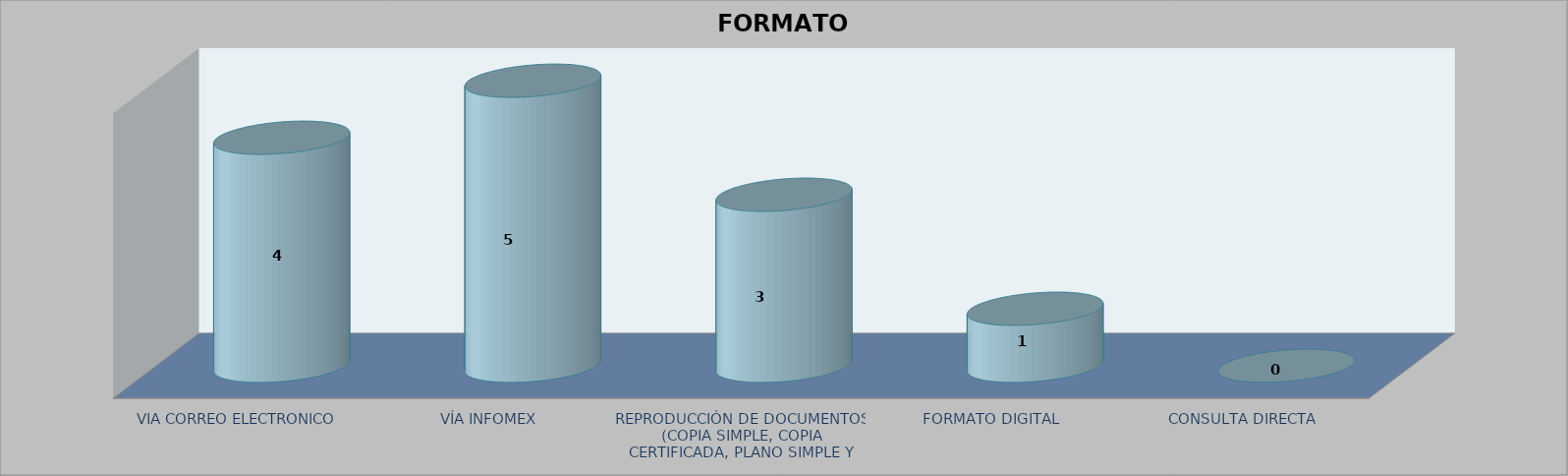
| Category |        FORMATO SOLICITADO | Series 1 | Series 2 |
|---|---|---|---|
| VIA CORREO ELECTRONICO |  |  | 4 |
| VÍA INFOMEX |  |  | 5 |
| REPRODUCCIÓN DE DOCUMENTOS (COPIA SIMPLE, COPIA CERTIFICADA, PLANO SIMPLE Y PLANO CERTIFICADO) |  |  | 3 |
| FORMATO DIGITAL |  |  | 1 |
| CONSULTA DIRECTA |  |  | 0 |